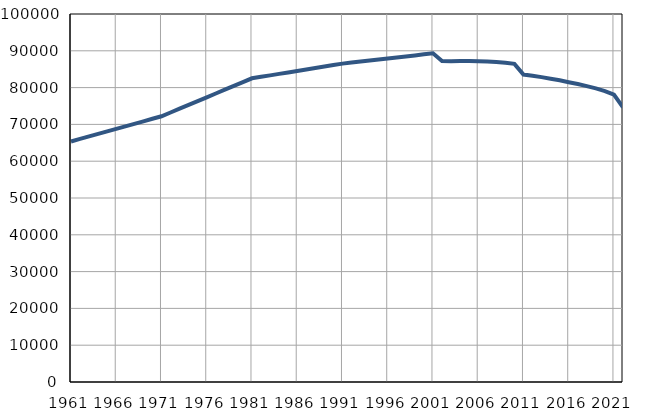
| Category | Број
становника |
|---|---|
| 1961.0 | 65367 |
| 1962.0 | 66050 |
| 1963.0 | 66735 |
| 1964.0 | 67420 |
| 1965.0 | 68103 |
| 1966.0 | 68788 |
| 1967.0 | 69472 |
| 1968.0 | 70156 |
| 1969.0 | 70840 |
| 1970.0 | 71524 |
| 1971.0 | 72208 |
| 1972.0 | 73240 |
| 1973.0 | 74272 |
| 1974.0 | 75304 |
| 1975.0 | 76336 |
| 1976.0 | 77368 |
| 1977.0 | 78399 |
| 1978.0 | 79431 |
| 1979.0 | 80463 |
| 1980.0 | 81495 |
| 1981.0 | 82527 |
| 1982.0 | 82926 |
| 1983.0 | 83325 |
| 1984.0 | 83724 |
| 1985.0 | 84123 |
| 1986.0 | 84523 |
| 1987.0 | 84922 |
| 1988.0 | 85321 |
| 1989.0 | 85720 |
| 1990.0 | 86119 |
| 1991.0 | 86518 |
| 1992.0 | 86797 |
| 1993.0 | 87077 |
| 1994.0 | 87356 |
| 1995.0 | 87635 |
| 1996.0 | 87915 |
| 1997.0 | 88194 |
| 1998.0 | 88474 |
| 1999.0 | 88753 |
| 2000.0 | 89032 |
| 2001.0 | 89312 |
| 2002.0 | 87251 |
| 2003.0 | 87190 |
| 2004.0 | 87234 |
| 2005.0 | 87215 |
| 2006.0 | 87174 |
| 2007.0 | 87095 |
| 2008.0 | 86950 |
| 2009.0 | 86753 |
| 2010.0 | 86451 |
| 2011.0 | 83551 |
| 2012.0 | 83241 |
| 2013.0 | 82845 |
| 2014.0 | 82425 |
| 2015.0 | 81986 |
| 2016.0 | 81468 |
| 2017.0 | 80961 |
| 2018.0 | 80402 |
| 2019.0 | 79782 |
| 2020.0 | 79068 |
| 2021.0 | 78094 |
| 2022.0 | 74631 |